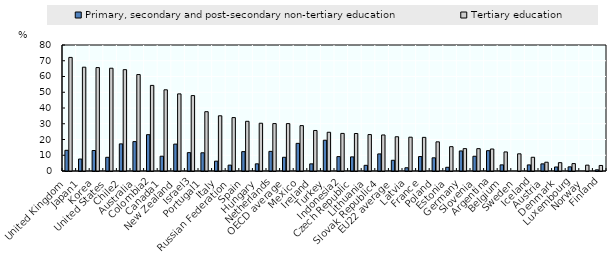
| Category | Primary, secondary and post-secondary non-tertiary education | Tertiary education |
|---|---|---|
| United Kingdom | 13.142 | 72.118 |
| Japan1 | 7.593 | 65.905 |
| Korea | 13.014 | 65.669 |
| United States | 8.691 | 65.257 |
| Chile2 | 17.217 | 64.339 |
| Australia | 18.669 | 61.24 |
| Colombia2 | 23.072 | 54.346 |
| Canada1 | 9.393 | 51.553 |
| New Zealand | 17.08 | 48.967 |
| Israel3 | 11.663 | 47.879 |
| Portugal1 | 11.565 | 37.65 |
| Italy | 6.242 | 35.052 |
| Russian Federation | 3.726 | 33.91 |
| Spain | 12.301 | 31.548 |
| Hungary | 4.546 | 30.324 |
| Netherlands | 12.462 | 30.102 |
| OECD average | 8.705 | 30.094 |
| Mexico | 17.541 | 28.817 |
| Ireland | 4.532 | 25.725 |
| Turkey | 19.54 | 24.584 |
| Indonesia2 | 9.14 | 23.864 |
| Czech Republic | 8.96 | 23.808 |
| Lithuania | 3.609 | 23.136 |
| Slovak Republic4 | 10.846 | 22.884 |
| EU22 average | 6.809 | 21.737 |
| Latvia | 2.049 | 21.464 |
| France | 9.175 | 21.359 |
| Poland | 8.369 | 18.503 |
| Estonia | 2.351 | 15.448 |
| Germany | 12.737 | 14.205 |
| Slovenia | 9.36 | 14.193 |
| Argentina | 12.905 | 13.963 |
| Belgium | 3.899 | 12.106 |
| Sweden | 0 | 10.912 |
| Iceland | 3.87 | 8.714 |
| Austria | 4.525 | 5.569 |
| Denmark | 2.552 | 5.291 |
| Luxembourg | 2.638 | 4.701 |
| Norway | 0 | 3.718 |
| Finland | 0.738 | 3.516 |